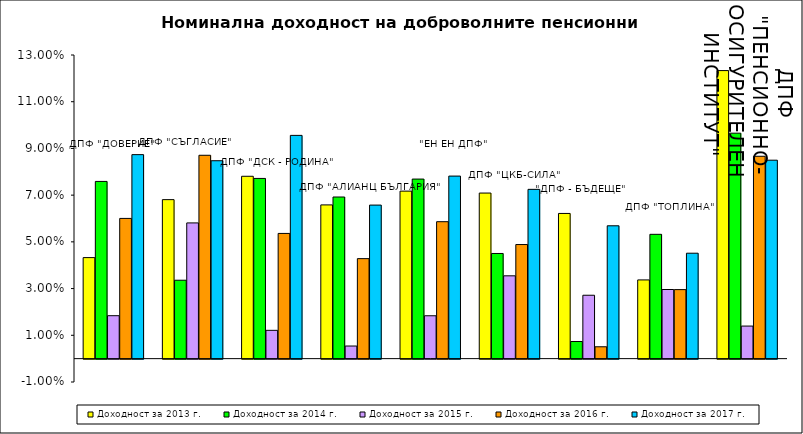
| Category | Доходност за 2013 г. | Доходност за 2014 г. | Доходност за 2015 г. | Доходност за 2016 г. | Доходност за 2017 г. |
|---|---|---|---|---|---|
| ДПФ "ДОВЕРИЕ"  | 0.043 | 0.076 | 0.018 | 0.06 | 0.087 |
| ДПФ "СЪГЛАСИЕ"  | 0.068 | 0.034 | 0.058 | 0.087 | 0.085 |
| ДПФ "ДСК - РОДИНА" | 0.078 | 0.077 | 0.012 | 0.054 | 0.096 |
| ДПФ "АЛИАНЦ БЪЛГАРИЯ" | 0.066 | 0.069 | 0.005 | 0.043 | 0.066 |
| "ЕН ЕН ДПФ" | 0.072 | 0.077 | 0.018 | 0.059 | 0.078 |
| ДПФ "ЦКБ-СИЛА" | 0.071 | 0.045 | 0.035 | 0.049 | 0.072 |
| "ДПФ - БЪДЕЩЕ" | 0.062 | 0.007 | 0.027 | 0.005 | 0.057 |
| ДПФ "ТОПЛИНА" | 0.034 | 0.053 | 0.03 | 0.03 | 0.045 |
| ДПФ "ПЕНСИОННООСИГУРИТЕЛЕН ИНСТИТУТ" | 0.123 | 0.097 | 0.014 | 0.087 | 0.085 |